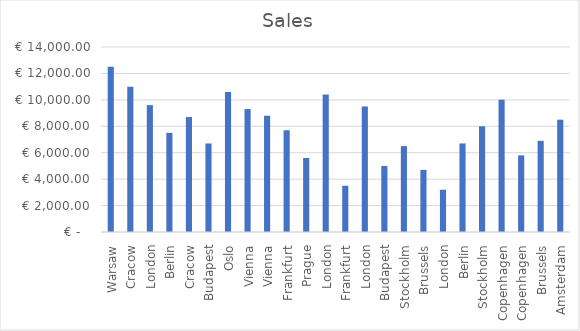
| Category | Sales |
|---|---|
| Warsaw | 12500 |
| Cracow | 11000 |
| London | 9600 |
| Berlin | 7500 |
| Cracow | 8700 |
| Budapest | 6700 |
| Oslo | 10600 |
| Vienna | 9300 |
| Vienna | 8800 |
| Frankfurt | 7700 |
| Prague | 5600 |
| London | 10400 |
| Frankfurt | 3500 |
| London | 9500 |
| Budapest | 5000 |
| Stockholm | 6500 |
| Brussels | 4700 |
| London | 3200 |
| Berlin | 6700 |
| Stockholm | 8000 |
| Copenhagen | 10000 |
| Copenhagen | 5800 |
| Brussels | 6900 |
| Amsterdam | 8500 |